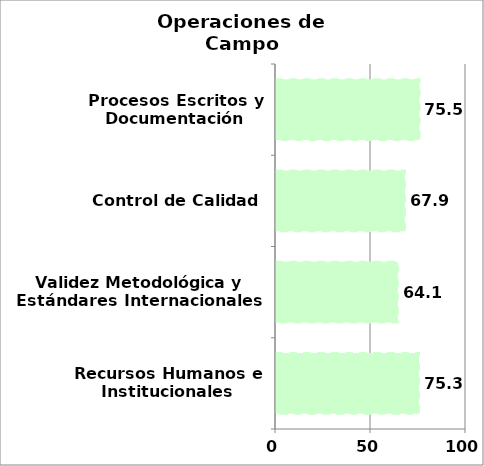
| Category | Series 0 |
|---|---|
| Recursos Humanos e Institucionales | 75.266 |
| Validez Metodológica y Estándares Internacionales | 64.126 |
| Control de Calidad | 67.857 |
| Procesos Escritos y Documentación | 75.505 |